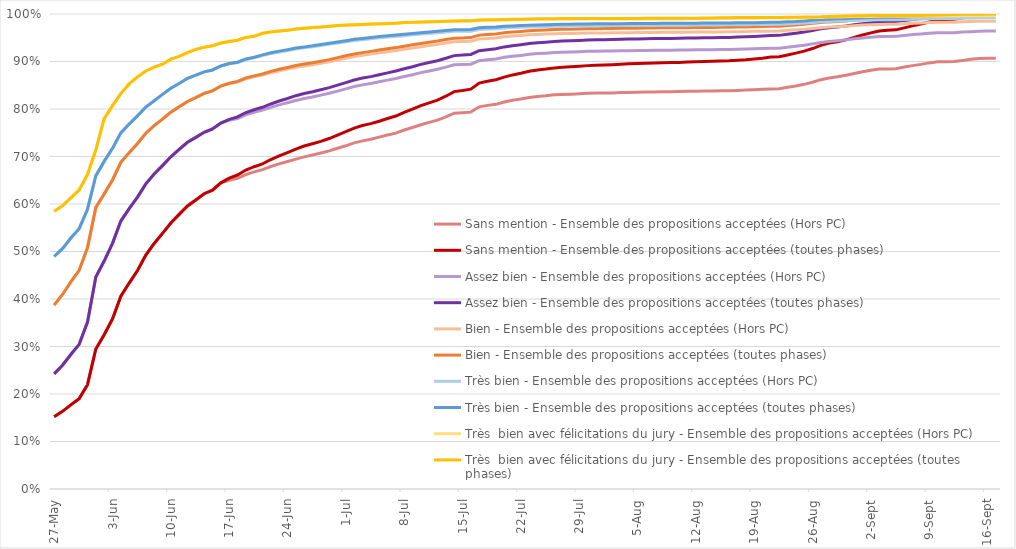
| Category | Sans mention - | Assez bien - | Bien - | Très bien - | Très  bien avec félicitations du jury - |
|---|---|---|---|---|---|
| 2021-05-27 | 0.152 | 0.242 | 0.387 | 0.489 | 0.585 |
| 2021-05-28 | 0.163 | 0.261 | 0.41 | 0.506 | 0.596 |
| 2021-05-29 | 0.177 | 0.283 | 0.436 | 0.528 | 0.613 |
| 2021-05-30 | 0.19 | 0.305 | 0.46 | 0.548 | 0.629 |
| 2021-05-31 | 0.22 | 0.351 | 0.508 | 0.589 | 0.662 |
| 2021-06-01 | 0.295 | 0.446 | 0.593 | 0.659 | 0.714 |
| 2021-06-02 | 0.325 | 0.48 | 0.621 | 0.69 | 0.78 |
| 2021-06-03 | 0.358 | 0.517 | 0.651 | 0.717 | 0.807 |
| 2021-06-04 | 0.406 | 0.564 | 0.688 | 0.75 | 0.832 |
| 2021-06-05 | 0.434 | 0.59 | 0.708 | 0.768 | 0.853 |
| 2021-06-06 | 0.46 | 0.615 | 0.727 | 0.786 | 0.868 |
| 2021-06-07 | 0.492 | 0.642 | 0.749 | 0.804 | 0.88 |
| 2021-06-08 | 0.517 | 0.663 | 0.765 | 0.817 | 0.888 |
| 2021-06-09 | 0.538 | 0.681 | 0.779 | 0.831 | 0.894 |
| 2021-06-10 | 0.56 | 0.699 | 0.793 | 0.844 | 0.905 |
| 2021-06-11 | 0.578 | 0.715 | 0.805 | 0.854 | 0.911 |
| 2021-06-12 | 0.596 | 0.73 | 0.816 | 0.865 | 0.919 |
| 2021-06-13 | 0.609 | 0.74 | 0.824 | 0.871 | 0.925 |
| 2021-06-14 | 0.622 | 0.751 | 0.833 | 0.878 | 0.93 |
| 2021-06-15 | 0.629 | 0.758 | 0.838 | 0.882 | 0.933 |
| 2021-06-16 | 0.645 | 0.77 | 0.848 | 0.891 | 0.939 |
| 2021-06-17 | 0.655 | 0.778 | 0.854 | 0.896 | 0.942 |
| 2021-06-18 | 0.661 | 0.784 | 0.858 | 0.899 | 0.945 |
| 2021-06-19 | 0.672 | 0.793 | 0.865 | 0.905 | 0.951 |
| 2021-06-20 | 0.679 | 0.798 | 0.87 | 0.909 | 0.953 |
| 2021-06-21 | 0.685 | 0.804 | 0.874 | 0.914 | 0.959 |
| 2021-06-22 | 0.694 | 0.811 | 0.879 | 0.918 | 0.962 |
| 2021-06-23 | 0.701 | 0.817 | 0.884 | 0.922 | 0.964 |
| 2021-06-24 | 0.708 | 0.822 | 0.887 | 0.925 | 0.966 |
| 2021-06-25 | 0.716 | 0.828 | 0.892 | 0.928 | 0.968 |
| 2021-06-26 | 0.722 | 0.833 | 0.895 | 0.931 | 0.97 |
| 2021-06-27 | 0.727 | 0.836 | 0.897 | 0.933 | 0.972 |
| 2021-06-28 | 0.732 | 0.84 | 0.901 | 0.936 | 0.973 |
| 2021-06-29 | 0.738 | 0.845 | 0.904 | 0.938 | 0.974 |
| 2021-06-30 | 0.745 | 0.85 | 0.908 | 0.941 | 0.976 |
| 2021-07-01 | 0.752 | 0.856 | 0.912 | 0.944 | 0.977 |
| 2021-07-02 | 0.76 | 0.861 | 0.916 | 0.947 | 0.977 |
| 2021-07-03 | 0.765 | 0.865 | 0.919 | 0.949 | 0.978 |
| 2021-07-04 | 0.769 | 0.868 | 0.921 | 0.95 | 0.979 |
| 2021-07-05 | 0.774 | 0.872 | 0.924 | 0.953 | 0.979 |
| 2021-07-06 | 0.78 | 0.876 | 0.927 | 0.954 | 0.98 |
| 2021-07-07 | 0.785 | 0.88 | 0.929 | 0.956 | 0.981 |
| 2021-07-08 | 0.793 | 0.885 | 0.932 | 0.957 | 0.982 |
| 2021-07-09 | 0.8 | 0.889 | 0.935 | 0.959 | 0.982 |
| 2021-07-10 | 0.807 | 0.894 | 0.938 | 0.961 | 0.983 |
| 2021-07-11 | 0.813 | 0.898 | 0.941 | 0.962 | 0.984 |
| 2021-07-12 | 0.819 | 0.902 | 0.943 | 0.963 | 0.984 |
| 2021-07-13 | 0.827 | 0.907 | 0.946 | 0.965 | 0.985 |
| 2021-07-14 | 0.837 | 0.912 | 0.949 | 0.967 | 0.985 |
| 2021-07-15 | 0.839 | 0.913 | 0.95 | 0.967 | 0.986 |
| 2021-07-16 | 0.842 | 0.915 | 0.95 | 0.967 | 0.986 |
| 2021-07-17 | 0.854 | 0.923 | 0.956 | 0.971 | 0.987 |
| 2021-07-18 | 0.858 | 0.925 | 0.957 | 0.972 | 0.988 |
| 2021-07-19 | 0.862 | 0.927 | 0.958 | 0.973 | 0.988 |
| 2021-07-20 | 0.867 | 0.931 | 0.961 | 0.974 | 0.989 |
| 2021-07-21 | 0.872 | 0.933 | 0.962 | 0.975 | 0.989 |
| 2021-07-22 | 0.875 | 0.935 | 0.963 | 0.976 | 0.989 |
| 2021-07-23 | 0.879 | 0.938 | 0.965 | 0.976 | 0.99 |
| 2021-07-24 | 0.882 | 0.94 | 0.966 | 0.977 | 0.99 |
| 2021-07-25 | 0.884 | 0.941 | 0.966 | 0.977 | 0.99 |
| 2021-07-26 | 0.886 | 0.942 | 0.967 | 0.978 | 0.99 |
| 2021-07-27 | 0.888 | 0.943 | 0.968 | 0.978 | 0.99 |
| 2021-07-28 | 0.889 | 0.944 | 0.968 | 0.979 | 0.99 |
| 2021-07-29 | 0.89 | 0.944 | 0.969 | 0.979 | 0.99 |
| 2021-07-30 | 0.891 | 0.945 | 0.969 | 0.979 | 0.99 |
| 2021-07-31 | 0.892 | 0.946 | 0.969 | 0.979 | 0.991 |
| 2021-08-01 | 0.893 | 0.946 | 0.969 | 0.979 | 0.991 |
| 2021-08-02 | 0.893 | 0.946 | 0.969 | 0.979 | 0.991 |
| 2021-08-03 | 0.894 | 0.947 | 0.97 | 0.98 | 0.991 |
| 2021-08-04 | 0.895 | 0.947 | 0.97 | 0.98 | 0.991 |
| 2021-08-05 | 0.896 | 0.947 | 0.97 | 0.98 | 0.991 |
| 2021-08-06 | 0.896 | 0.948 | 0.97 | 0.98 | 0.991 |
| 2021-08-07 | 0.897 | 0.948 | 0.971 | 0.98 | 0.991 |
| 2021-08-08 | 0.897 | 0.948 | 0.971 | 0.98 | 0.991 |
| 2021-08-09 | 0.898 | 0.949 | 0.971 | 0.98 | 0.991 |
| 2021-08-10 | 0.898 | 0.949 | 0.971 | 0.98 | 0.991 |
| 2021-08-11 | 0.899 | 0.949 | 0.971 | 0.981 | 0.991 |
| 2021-08-12 | 0.899 | 0.95 | 0.971 | 0.981 | 0.991 |
| 2021-08-13 | 0.9 | 0.95 | 0.972 | 0.981 | 0.991 |
| 2021-08-14 | 0.9 | 0.95 | 0.972 | 0.981 | 0.992 |
| 2021-08-15 | 0.901 | 0.95 | 0.972 | 0.981 | 0.992 |
| 2021-08-16 | 0.901 | 0.951 | 0.972 | 0.981 | 0.992 |
| 2021-08-17 | 0.903 | 0.951 | 0.972 | 0.981 | 0.992 |
| 2021-08-18 | 0.904 | 0.952 | 0.973 | 0.982 | 0.992 |
| 2021-08-19 | 0.905 | 0.953 | 0.973 | 0.982 | 0.992 |
| 2021-08-20 | 0.907 | 0.954 | 0.974 | 0.982 | 0.993 |
| 2021-08-21 | 0.909 | 0.955 | 0.974 | 0.982 | 0.993 |
| 2021-08-22 | 0.91 | 0.955 | 0.974 | 0.983 | 0.993 |
| 2021-08-23 | 0.914 | 0.957 | 0.976 | 0.984 | 0.993 |
| 2021-08-24 | 0.918 | 0.96 | 0.977 | 0.984 | 0.993 |
| 2021-08-25 | 0.922 | 0.962 | 0.978 | 0.985 | 0.994 |
| 2021-08-26 | 0.927 | 0.965 | 0.98 | 0.987 | 0.994 |
| 2021-08-27 | 0.934 | 0.969 | 0.982 | 0.988 | 0.994 |
| 2021-08-28 | 0.939 | 0.971 | 0.983 | 0.989 | 0.995 |
| 2021-08-29 | 0.942 | 0.973 | 0.984 | 0.99 | 0.995 |
| 2021-08-30 | 0.946 | 0.975 | 0.985 | 0.991 | 0.996 |
| 2021-08-31 | 0.951 | 0.977 | 0.987 | 0.991 | 0.996 |
| 2021-09-01 | 0.956 | 0.979 | 0.988 | 0.992 | 0.996 |
| 2021-09-02 | 0.96 | 0.981 | 0.989 | 0.993 | 0.997 |
| 2021-09-03 | 0.964 | 0.983 | 0.99 | 0.993 | 0.997 |
| 2021-09-04 | 0.966 | 0.984 | 0.99 | 0.993 | 0.997 |
| 2021-09-05 | 0.967 | 0.984 | 0.99 | 0.993 | 0.997 |
| 2021-09-06 | 0.971 | 0.986 | 0.992 | 0.994 | 0.997 |
| 2021-09-07 | 0.975 | 0.988 | 0.993 | 0.995 | 0.997 |
| 2021-09-08 | 0.979 | 0.99 | 0.994 | 0.995 | 0.997 |
| 2021-09-09 | 0.983 | 0.992 | 0.995 | 0.996 | 0.998 |
| 2021-09-10 | 0.987 | 0.994 | 0.996 | 0.997 | 0.998 |
| 2021-09-11 | 0.988 | 0.994 | 0.996 | 0.997 | 0.999 |
| 2021-09-12 | 0.989 | 0.995 | 0.997 | 0.998 | 0.999 |
| 2021-09-13 | 0.992 | 0.996 | 0.997 | 0.998 | 0.999 |
| 2021-09-14 | 0.995 | 0.998 | 0.999 | 0.999 | 0.999 |
| 2021-09-15 | 0.998 | 0.999 | 1 | 1 | 1 |
| 2021-09-16 | 1 | 1 | 1 | 1 | 1 |
| 2021-09-17 | 1 | 1 | 1 | 1 | 1 |